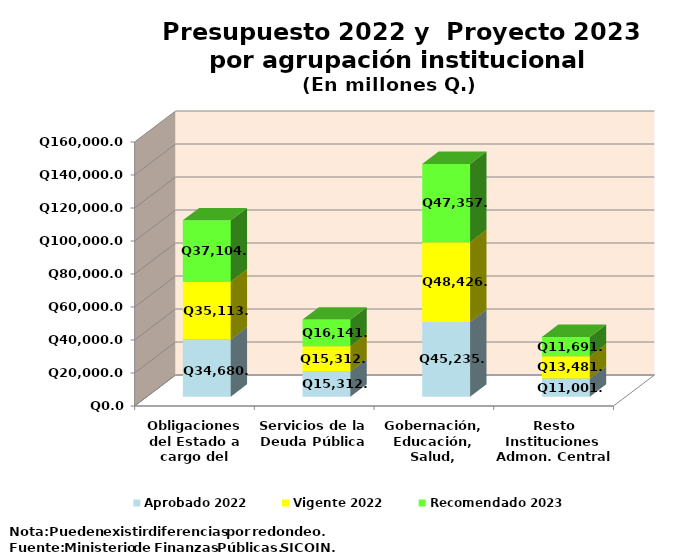
| Category | Aprobado 2022 | Vigente 2022 | Recomendado 2023 |
|---|---|---|---|
| Obligaciones del Estado a cargo del Tesoro | 34680.8 | 35113.3 | 37104 |
| Servicios de la Deuda Pública | 15312 | 15312 | 16141.7 |
| Gobernación, Educación, Salud, Comunicaciones | 45235.1 | 48426.3 | 47357.4 |
| Resto Instituciones Admon. Central | 11001.6 | 13481.5 | 11691.6 |